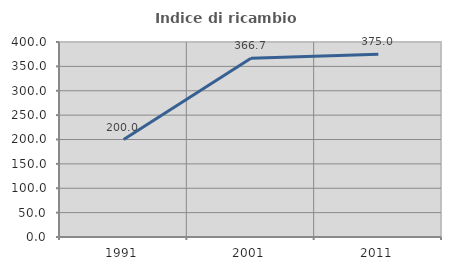
| Category | Indice di ricambio occupazionale  |
|---|---|
| 1991.0 | 200 |
| 2001.0 | 366.667 |
| 2011.0 | 375 |